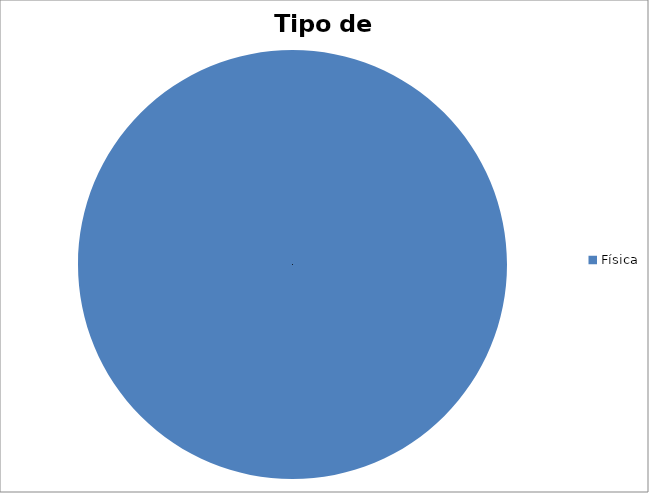
| Category | Quantitativo |
|---|---|
| Física | 1 |